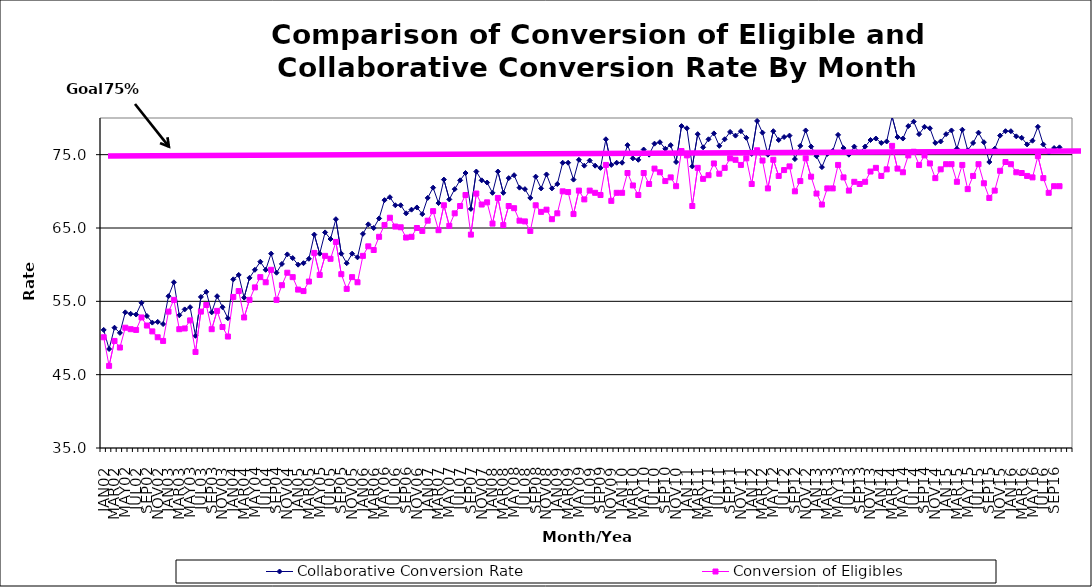
| Category | Collaborative Conversion Rate | Conversion of Eligibles |
|---|---|---|
| JAN02 | 51.1 | 50.1 |
| FEB02 | 48.5 | 46.2 |
| MAR02 | 51.4 | 49.6 |
| APR02 | 50.7 | 48.7 |
| MAY02 | 53.5 | 51.4 |
| JUN02 | 53.3 | 51.2 |
| JUL02 | 53.2 | 51.1 |
| AUG02 | 54.8 | 52.8 |
| SEP02 | 53 | 51.7 |
| OCT02 | 52.1 | 50.9 |
| NOV02 | 52.2 | 50.1 |
| DEC02 | 51.9 | 49.6 |
| JAN03 | 55.7 | 53.6 |
| FEB03 | 57.6 | 55.2 |
| MAR03 | 53.1 | 51.2 |
| APR03 | 53.9 | 51.3 |
| MAY03 | 54.2 | 52.4 |
| JUN03 | 50.3 | 48.1 |
| JUL03 | 55.6 | 53.6 |
| AUG03 | 56.3 | 54.5 |
| SEP03 | 53.5 | 51.2 |
| OCT03 | 55.7 | 53.7 |
| NOV03 | 54.2 | 51.5 |
| DEC03 | 52.7 | 50.2 |
| JAN04 | 58 | 55.6 |
| FEB04 | 58.6 | 56.4 |
| MAR04 | 55.5 | 52.8 |
| APR04 | 58.2 | 55.2 |
| MAY04 | 59.3 | 56.9 |
| JUN04 | 60.4 | 58.3 |
| JUL04 | 59.3 | 57.6 |
| AUG04 | 61.5 | 59.3 |
| SEP04 | 58.9 | 55.2 |
| OCT04 | 60.1 | 57.2 |
| NOV04 | 61.4 | 58.9 |
| DEC04 | 60.9 | 58.3 |
| JAN05 | 60 | 56.6 |
| FEB05 | 60.2 | 56.4 |
| MAR05 | 60.8 | 57.7 |
| APR05 | 64.1 | 61.6 |
| MAY05 | 61.5 | 58.6 |
| JUN05 | 64.4 | 61.2 |
| JUL05 | 63.5 | 60.8 |
| AUG05 | 66.2 | 63.1 |
| SEP05 | 61.5 | 58.7 |
| OCT05 | 60.2 | 56.7 |
| NOV05 | 61.5 | 58.3 |
| DEC05 | 61 | 57.6 |
| JAN06 | 64.2 | 61.2 |
| FEB06 | 65.5 | 62.5 |
| MAR06 | 65 | 62 |
| APR06 | 66.3 | 63.8 |
| MAY06 | 68.8 | 65.4 |
| JUN06 | 69.2 | 66.4 |
| JUL06 | 68.1 | 65.2 |
| AUG06 | 68.1 | 65.1 |
| SEP06 | 67 | 63.7 |
| OCT06 | 67.5 | 63.8 |
| NOV06 | 67.8 | 65 |
| DEC06 | 66.9 | 64.6 |
| JAN07 | 69.1 | 66 |
| FEB07 | 70.5 | 67.3 |
| MAR07 | 68.4 | 64.7 |
| APR07 | 71.6 | 68.1 |
| MAY07 | 68.9 | 65.3 |
| JUN07 | 70.3 | 67 |
| JUL07 | 71.5 | 68 |
| AUG07 | 72.5 | 69.5 |
| SEP07 | 67.6 | 64.1 |
| OCT07 | 72.7 | 69.7 |
| NOV07 | 71.5 | 68.2 |
| DEC07 | 71.2 | 68.5 |
| JAN08 | 69.8 | 65.6 |
| FEB08 | 72.7 | 69.1 |
| MAR08 | 69.8 | 65.4 |
| APR08 | 71.8 | 68 |
| MAY08 | 72.2 | 67.7 |
| JUN08 | 70.5 | 66 |
| JUL08 | 70.3 | 65.9 |
| AUG08 | 69.1 | 64.6 |
| SEP08 | 72 | 68.1 |
| OCT08 | 70.4 | 67.2 |
| NOV08 | 72.3 | 67.5 |
| DEC08 | 70.4 | 66.2 |
| JAN09 | 71 | 67 |
| FEB09 | 73.9 | 70 |
| MAR09 | 73.9 | 69.9 |
| APR09 | 71.6 | 66.9 |
| MAY09 | 74.3 | 70.1 |
| JUN09 | 73.5 | 68.9 |
| JUL09 | 74.2 | 70.1 |
| AUG09 | 73.5 | 69.8 |
| SEP09 | 73.2 | 69.5 |
| OCT09 | 77.1 | 73.6 |
| NOV09 | 73.6 | 68.7 |
| DEC09 | 73.9 | 69.8 |
| JAN10 | 73.9 | 69.8 |
| FEB10 | 76.3 | 72.5 |
| MAR10 | 74.5 | 70.8 |
| APR10 | 74.3 | 69.5 |
| MAY10 | 75.7 | 72.5 |
| JUN10 | 75 | 71 |
| JUL10 | 76.5 | 73.1 |
| AUG10 | 76.7 | 72.6 |
| SEP10 | 75.8 | 71.4 |
| OCT10 | 76.3 | 71.9 |
| NOV10 | 74 | 70.7 |
| DEC10 | 78.9 | 75.5 |
| JAN11 | 78.6 | 74.9 |
| FEB11 | 73.4 | 68 |
| MAR11 | 77.8 | 73.2 |
| APR11 | 76 | 71.7 |
| MAY11 | 77.1 | 72.2 |
| JUN11 | 77.9 | 73.8 |
| JUL11 | 76.2 | 72.4 |
| AUG11 | 77.1 | 73.2 |
| SEP11 | 78.1 | 74.5 |
| OCT11 | 77.6 | 74.3 |
| NOV11 | 78.2 | 73.6 |
| DEC11 | 77.3 | 74.5 |
| JAN12 | 75.1 | 71 |
| FEB12 | 79.6 | 75.6 |
| MAR12 | 78 | 74.2 |
| APR12 | 75 | 70.4 |
| MAY12 | 78.2 | 74.3 |
| JUN12 | 77 | 72.1 |
| JUL12 | 77.4 | 72.9 |
| AUG12 | 77.6 | 73.4 |
| SEP12 | 74.4 | 70 |
| OCT12 | 76.2 | 71.4 |
| NOV12 | 78.3 | 74.5 |
| DEC12 | 76.1 | 72 |
| JAN13 | 74.8 | 69.7 |
| FEB13 | 73.3 | 68.2 |
| MAR13 | 75.1 | 70.4 |
| APR13 | 75.5 | 70.4 |
| MAY13 | 77.7 | 73.6 |
| JUN13 | 75.9 | 71.9 |
| JUL13 | 75 | 70.1 |
| AUG13 | 76.1 | 71.3 |
| SEP13 | 75.3 | 71 |
| OCT13 | 76.1 | 71.3 |
| NOV13 | 77 | 72.7 |
| DEC13 | 77.2 | 73.2 |
| JAN14 | 76.6 | 72.1 |
| FEB14 | 76.8 | 73 |
| MAR14 | 80.2 | 76.2 |
| APR14 | 77.4 | 73.1 |
| MAY14 | 77.2 | 72.6 |
| JUN14 | 78.9 | 74.9 |
| JUL14 | 79.5 | 75.4 |
| AUG14 | 77.8 | 73.6 |
| SEP14 | 78.8 | 74.9 |
| OCT14 | 78.6 | 73.8 |
| NOV14 | 76.6 | 71.8 |
| DEC14 | 76.8 | 73 |
| JAN15 | 77.8 | 73.7 |
| FEB15 | 78.3 | 73.7 |
| MAR15 | 75.8 | 71.3 |
| APR15 | 78.4 | 73.6 |
| MAY15 | 75.6 | 70.3 |
| JUN15 | 76.6 | 72.1 |
| JUL15 | 78 | 73.7 |
| AUG15 | 76.7 | 71.1 |
| SEP15 | 74 | 69.1 |
| OCT15 | 75.8 | 70.1 |
| NOV15 | 77.6 | 72.8 |
| DEC15 | 78.2 | 74 |
| JAN16 | 78.2 | 73.7 |
| FEB16 | 77.5 | 72.6 |
| MAR16 | 77.3 | 72.5 |
| APR16 | 76.4 | 72.1 |
| MAY16 | 76.9 | 71.9 |
| JUN16 | 78.8 | 74.8 |
| JUL16 | 76.4 | 71.8 |
| AUG16 | 75.3 | 69.8 |
| SEP16 | 75.9 | 70.7 |
| OCT16 | 76 | 70.7 |